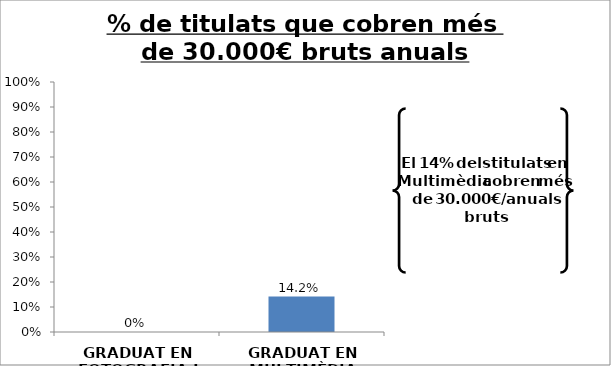
| Category | Series 0 |
|---|---|
| GRADUAT EN FOTOGRAFIA I CREACIÓ DIGITAL | 0 |
| GRADUAT EN MULTIMÈDIA | 0.142 |